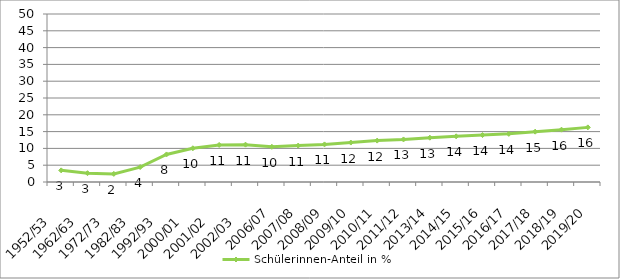
| Category | Schülerinnen-Anteil in % |
|---|---|
| 1952/53   | 3.463 |
| 1962/63   | 2.624 |
| 1972/73   | 2.417 |
| 1982/83   | 4.441 |
| 1992/93   | 8.201 |
| 2000/01   | 10.034 |
| 2001/02   | 11.031 |
| 2002/03   | 11.116 |
| 2006/07 | 10.478 |
| 2007/08 | 10.836 |
| 2008/09 | 11.189 |
| 2009/10 | 11.742 |
| 2010/11 | 12.321 |
| 2011/12 | 12.665 |
| 2013/14 | 13.192 |
| 2014/15 | 13.592 |
| 2015/16 | 13.974 |
| 2016/17 | 14.325 |
| 2017/18 | 14.98 |
| 2018/19 | 15.578 |
| 2019/20 | 16.256 |